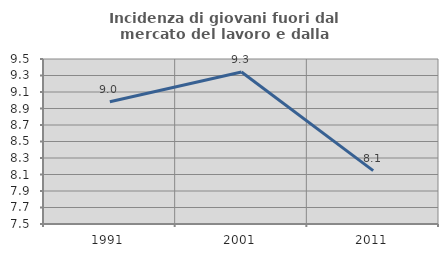
| Category | Incidenza di giovani fuori dal mercato del lavoro e dalla formazione  |
|---|---|
| 1991.0 | 8.981 |
| 2001.0 | 9.343 |
| 2011.0 | 8.147 |